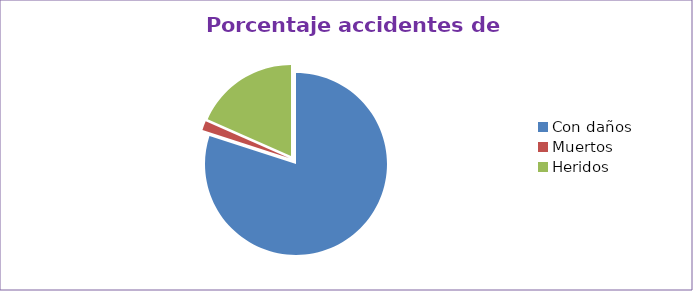
| Category | Series 0 |
|---|---|
| Con daños  | 80 |
| Muertos  | 1.6 |
| Heridos  | 18.4 |